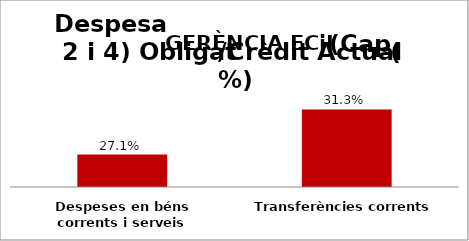
| Category | Series 0 |
|---|---|
| Despeses en béns corrents i serveis | 0.271 |
| Transferències corrents | 0.313 |